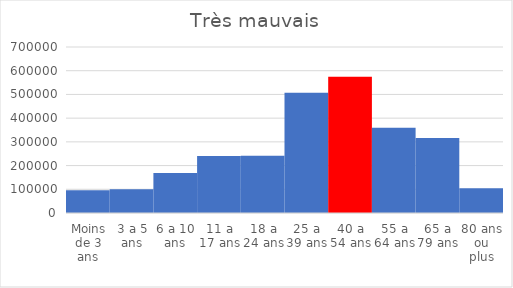
| Category | Series 0 |
|---|---|
| Moins de 3 ans | 95453 |
| 3 а 5 ans | 100113 |
| 6 а 10 ans | 168844 |
| 11 а 17 ans | 240243 |
| 18 а 24 ans | 241194 |
| 25 а 39 ans | 507209 |
| 40 а 54 ans | 574710 |
| 55 а 64 ans | 359855 |
| 65 а 79 ans | 316241 |
| 80 ans ou plus | 104696 |